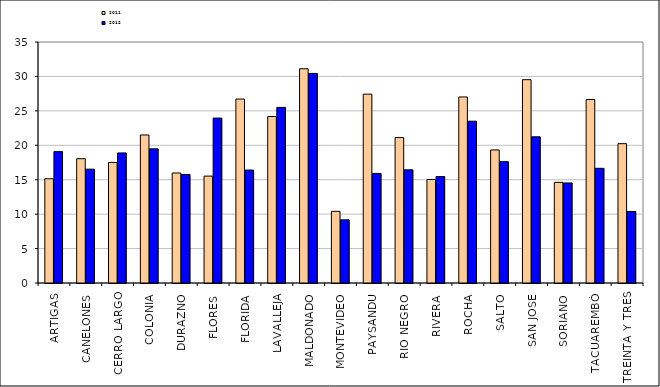
| Category | 2011 | 2012 |
|---|---|---|
| ARTIGAS | 15.139 | 19.079 |
| CANELONES | 18.053 | 16.533 |
| CERRO LARGO | 17.505 | 18.891 |
| COLONIA | 21.497 | 19.48 |
| DURAZNO | 15.977 | 15.765 |
| FLORES | 15.525 | 23.952 |
| FLORIDA | 26.717 | 16.406 |
| LAVALLEJA | 24.175 | 25.504 |
| MALDONADO | 31.111 | 30.432 |
| MONTEVIDEO | 10.408 | 9.173 |
| PAYSANDU | 27.426 | 15.912 |
| RIO NEGRO | 21.122 | 16.434 |
| RIVERA | 15.036 | 15.46 |
| ROCHA | 27.021 | 23.499 |
| SALTO | 19.323 | 17.617 |
| SAN JOSE | 29.527 | 21.236 |
| SORIANO | 14.616 | 14.529 |
| TACUAREMBÓ | 26.654 | 16.657 |
| TREINTA Y TRES | 20.235 | 10.388 |